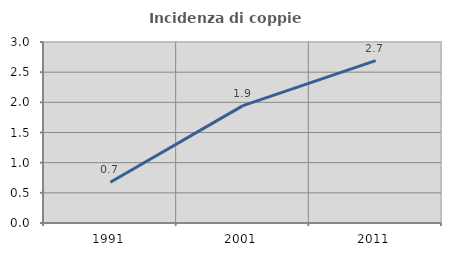
| Category | Incidenza di coppie miste |
|---|---|
| 1991.0 | 0.675 |
| 2001.0 | 1.945 |
| 2011.0 | 2.692 |